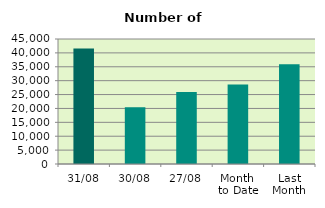
| Category | Series 0 |
|---|---|
| 31/08 | 41588 |
| 30/08 | 20436 |
| 27/08 | 25916 |
| Month 
to Date | 28637.636 |
| Last
Month | 35875.545 |